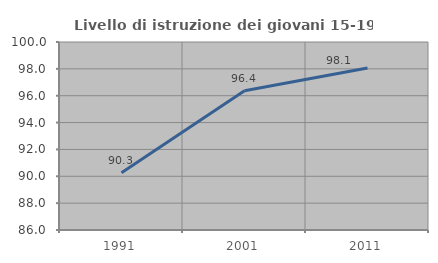
| Category | Livello di istruzione dei giovani 15-19 anni |
|---|---|
| 1991.0 | 90.267 |
| 2001.0 | 96.375 |
| 2011.0 | 98.071 |